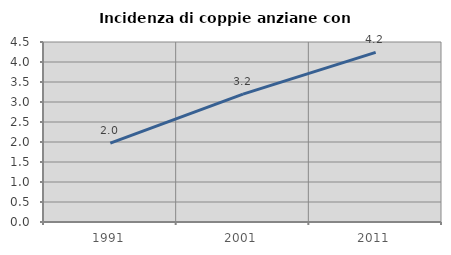
| Category | Incidenza di coppie anziane con figli |
|---|---|
| 1991.0 | 1.974 |
| 2001.0 | 3.196 |
| 2011.0 | 4.239 |